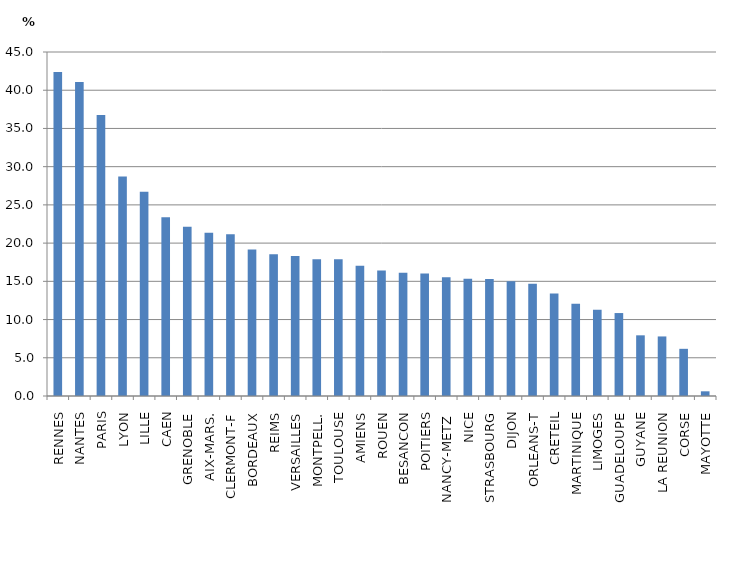
| Category | Part du secteur privé dans le second degré |
|---|---|
| RENNES | 42.388 |
| NANTES | 41.064 |
| PARIS | 36.757 |
| LYON | 28.728 |
| LILLE | 26.72 |
| CAEN | 23.371 |
| GRENOBLE | 22.126 |
| AIX-MARS. | 21.357 |
| CLERMONT-F | 21.168 |
| BORDEAUX | 19.168 |
| REIMS | 18.529 |
| VERSAILLES | 18.316 |
| MONTPELL. | 17.886 |
| TOULOUSE | 17.877 |
| AMIENS | 17.049 |
| ROUEN | 16.408 |
| BESANCON | 16.108 |
| POITIERS | 16.02 |
| NANCY-METZ  | 15.527 |
| NICE | 15.336 |
| STRASBOURG | 15.307 |
| DIJON | 15.022 |
| ORLEANS-T | 14.688 |
| CRETEIL | 13.41 |
| MARTINIQUE | 12.061 |
| LIMOGES | 11.272 |
| GUADELOUPE | 10.851 |
| GUYANE | 7.937 |
| LA REUNION | 7.791 |
| CORSE | 6.172 |
| MAYOTTE | 0.613 |